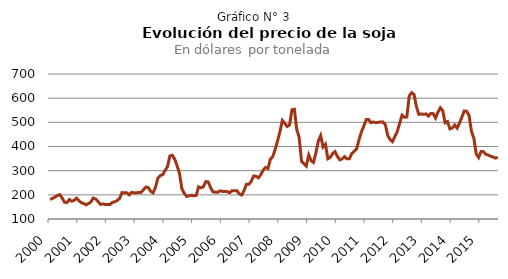
| Category | Soja |
|---|---|
| 2000.0 | 180.384 |
| nan | 185.758 |
| nan | 190.971 |
| nan | 197.104 |
| nan | 200.87 |
| nan | 186.952 |
| nan | 169.497 |
| nan | 167.867 |
| nan | 180.453 |
| nan | 173.608 |
| nan | 177.191 |
| nan | 185.965 |
| 2001.0 | 175.423 |
| nan | 167.453 |
| nan | 164.376 |
| nan | 158.611 |
| nan | 163.87 |
| nan | 170.232 |
| nan | 186.654 |
| nan | 182.749 |
| nan | 172.345 |
| nan | 160.632 |
| nan | 162.561 |
| nan | 160.15 |
| 2002.0 | 160.058 |
| nan | 160.196 |
| nan | 168.693 |
| nan | 171.358 |
| nan | 176.64 |
| nan | 185.368 |
| nan | 209.093 |
| nan | 208.22 |
| nan | 208.22 |
| nan | 200.089 |
| nan | 210.218 |
| nan | 208.243 |
| 2003.0 | 208.679 |
| nan | 209.644 |
| nan | 210.241 |
| nan | 221.724 |
| nan | 232.427 |
| nan | 229.809 |
| nan | 214.053 |
| nan | 208.243 |
| nan | 231.715 |
| nan | 269.014 |
| nan | 279.739 |
| nan | 283.207 |
| 2004.0 | 300.938 |
| nan | 316.579 |
| nan | 360.721 |
| nan | 363.546 |
| nan | 347.906 |
| nan | 320.69 |
| nan | 289.822 |
| nan | 225.813 |
| nan | 206.474 |
| nan | 193.452 |
| nan | 195.841 |
| nan | 198.62 |
| 2005.0 | 195.665 |
| nan | 197.589 |
| nan | 233.181 |
| nan | 228.765 |
| nan | 233.462 |
| nan | 254.742 |
| nan | 253.348 |
| nan | 230.427 |
| nan | 212.016 |
| nan | 211.167 |
| nan | 210.7 |
| nan | 216.543 |
| 2006.0 | 214.009 |
| nan | 214.366 |
| nan | 212.714 |
| nan | 208.902 |
| nan | 217.356 |
| nan | 216.504 |
| nan | 217.252 |
| nan | 203.844 |
| nan | 199.307 |
| nan | 217.886 |
| nan | 244 |
| nan | 243.308 |
| 2007.0 | 255.867 |
| nan | 278.039 |
| nan | 276.96 |
| nan | 270.392 |
| nan | 283.206 |
| nan | 302.829 |
| nan | 313.476 |
| nan | 309.007 |
| nan | 347.562 |
| nan | 358.403 |
| nan | 389.015 |
| nan | 423.081 |
| 2008.0 | 462 |
| nan | 508 |
| nan | 496 |
| nan | 483 |
| nan | 489 |
| nan | 552 |
| nan | 554 |
| nan | 471 |
| nan | 438 |
| nan | 339 |
| nan | 329 |
| nan | 319 |
| 2009.0 | 365 |
| nan | 341 |
| nan | 334 |
| nan | 374 |
| nan | 422 |
| nan | 445 |
| nan | 398 |
| nan | 409 |
| nan | 349 |
| nan | 355 |
| nan | 371 |
| nan | 379 |
| 2010.0 | 359 |
| nan | 345 |
| nan | 349 |
| nan | 358 |
| nan | 349 |
| nan | 349 |
| nan | 371 |
| nan | 379.5 |
| nan | 390.2 |
| nan | 427.2 |
| nan | 460 |
| nan | 483.8 |
| 2011.0 | 511.1 |
| nan | 512.1 |
| nan | 498.7 |
| nan | 501.5 |
| nan | 498.8 |
| nan | 499.8 |
| nan | 501.8 |
| nan | 501.4 |
| nan | 490.9 |
| nan | 446 |
| nan | 428.8 |
| nan | 420 |
| 2012.0 | 441.7 |
| nan | 461.6 |
| nan | 496.3 |
| nan | 529.4 |
| nan | 520.9 |
| nan | 522.3 |
| nan | 609.4 |
| nan | 622.9 |
| nan | 615.2 |
| nan | 565.5 |
| nan | 533 |
| nan | 534.8 |
| 2013.0 | 533 |
| nan | 534.8 |
| nan | 526 |
| nan | 536.4 |
| nan | 536.1 |
| nan | 517.8 |
| nan | 542.2 |
| nan | 560.2 |
| nan | 548.3 |
| nan | 498 |
| nan | 503.2 |
| nan | 472.8 |
| 2014.0 | 476.7 |
| nan | 488.7 |
| nan | 476.1 |
| nan | 496.8 |
| nan | 522 |
| nan | 547.2 |
| nan | 546 |
| nan | 528 |
| nan | 463.2 |
| nan | 433 |
| nan | 368.8 |
| nan | 354.4 |
| 2015.0 | 379.3 |
| nan | 378.8 |
| nan | 367.5 |
| nan | 364.7 |
| nan | 359.6 |
| nan | 356.9 |
| nan | 351.9 |
| nan | 354.8 |